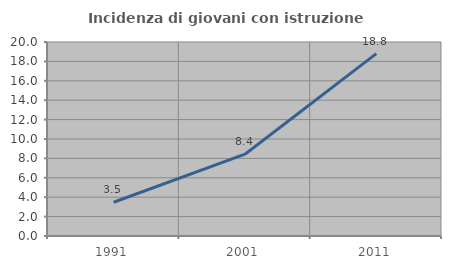
| Category | Incidenza di giovani con istruzione universitaria |
|---|---|
| 1991.0 | 3.483 |
| 2001.0 | 8.434 |
| 2011.0 | 18.803 |